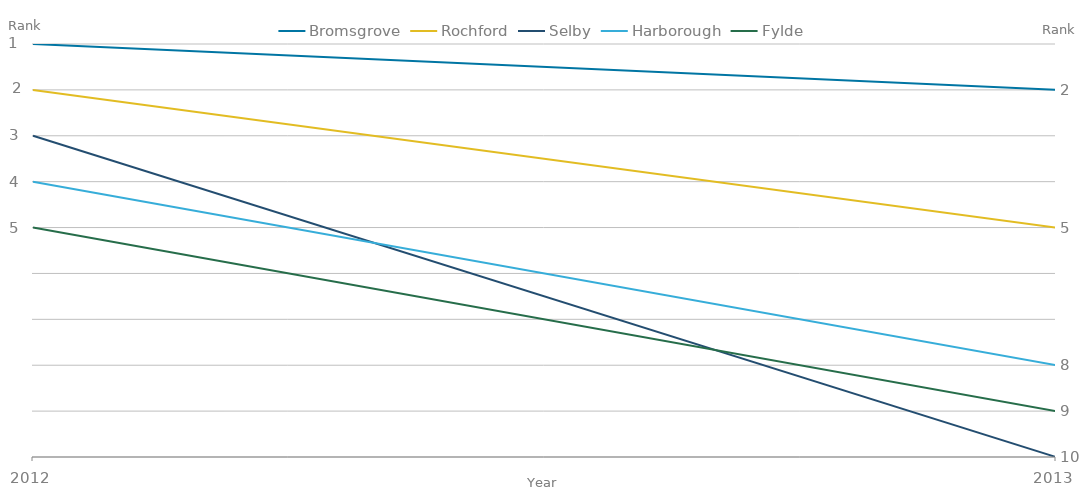
| Category | Bromsgrove | Rochford | Selby | Harborough | Fylde |
|---|---|---|---|---|---|
| 2012.0 | 1 | 2 | 3 | 4 | 5 |
| 2013.0 | 2 | 5 | 10 | 8 | 9 |